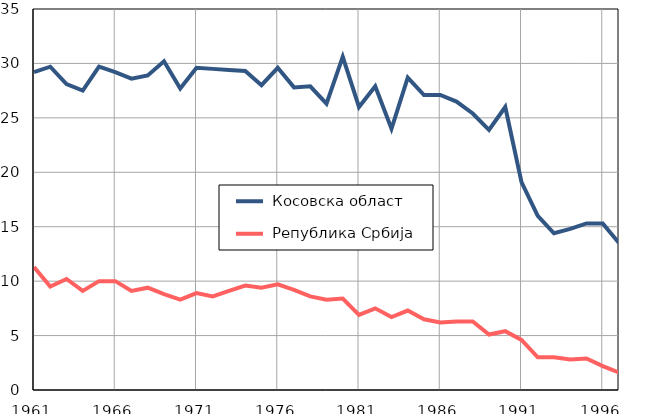
| Category |  Косовска област |  Република Србија |
|---|---|---|
| 1961.0 | 29.2 | 11.3 |
| 1962.0 | 29.7 | 9.5 |
| 1963.0 | 28.1 | 10.2 |
| 1964.0 | 27.5 | 9.1 |
| 1965.0 | 29.7 | 10 |
| 1966.0 | 29.2 | 10 |
| 1967.0 | 28.6 | 9.1 |
| 1968.0 | 28.9 | 9.4 |
| 1969.0 | 30.2 | 8.8 |
| 1970.0 | 27.7 | 8.3 |
| 1971.0 | 29.6 | 8.9 |
| 1972.0 | 29.5 | 8.6 |
| 1973.0 | 29.4 | 9.1 |
| 1974.0 | 29.3 | 9.6 |
| 1975.0 | 28 | 9.4 |
| 1976.0 | 29.6 | 9.7 |
| 1977.0 | 27.8 | 9.2 |
| 1978.0 | 27.9 | 8.6 |
| 1979.0 | 26.3 | 8.3 |
| 1980.0 | 30.6 | 8.4 |
| 1981.0 | 26 | 6.9 |
| 1982.0 | 27.9 | 7.5 |
| 1983.0 | 24 | 6.7 |
| 1984.0 | 28.7 | 7.3 |
| 1985.0 | 27.1 | 6.5 |
| 1986.0 | 27.1 | 6.2 |
| 1987.0 | 26.5 | 6.3 |
| 1988.0 | 25.4 | 6.3 |
| 1989.0 | 23.9 | 5.1 |
| 1990.0 | 26 | 5.4 |
| 1991.0 | 19.1 | 4.6 |
| 1992.0 | 16 | 3 |
| 1993.0 | 14.4 | 3 |
| 1994.0 | 14.8 | 2.8 |
| 1995.0 | 15.3 | 2.9 |
| 1996.0 | 15.3 | 2.2 |
| 1997.0 | 13.5 | 1.6 |